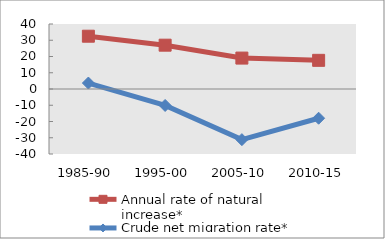
| Category | Annual rate of natural increase* | Crude net migration rate* |
|---|---|---|
| 1985-90 | 32.486 | 3.657 |
| 1995-00 | 26.969 | -10.127 |
| 2005-10 | 19.028 | -31.163 |
| 2010-15 | 17.637 | -17.99 |